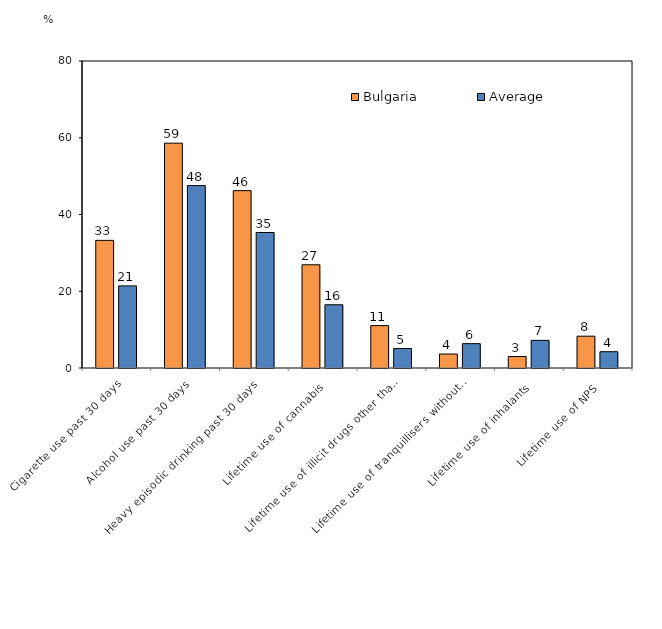
| Category | Bulgaria | Average |
|---|---|---|
| Cigarette use past 30 days | 33.26 | 21.397 |
| Alcohol use past 30 days | 58.59 | 47.531 |
| Heavy episodic drinking past 30 days | 46.22 | 35.309 |
| Lifetime use of cannabis | 26.9 | 16.48 |
| Lifetime use of illicit drugs other than cannabis | 11.05 | 5.079 |
| Lifetime use of tranquillisers without prescription  | 3.64 | 6.34 |
| Lifetime use of inhalants | 2.99 | 7.202 |
| Lifetime use of NPS | 8.29 | 4.246 |